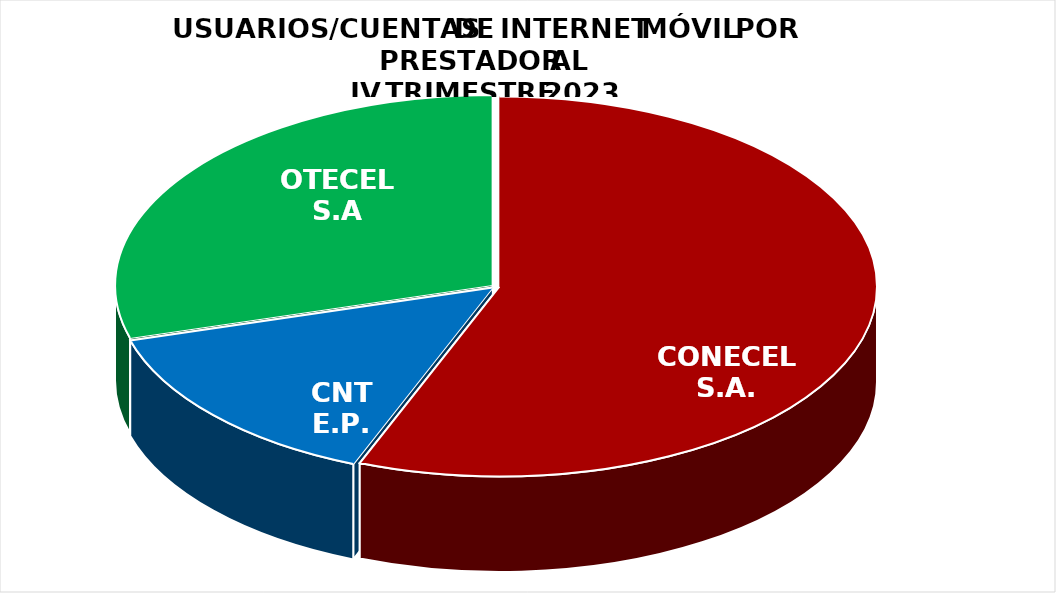
| Category | Series 0 |
|---|---|
| CONECEL S.A. | 6359065 |
| CNT E.P. | 1642257 |
| OTECEL S.A | 3348788.236 |